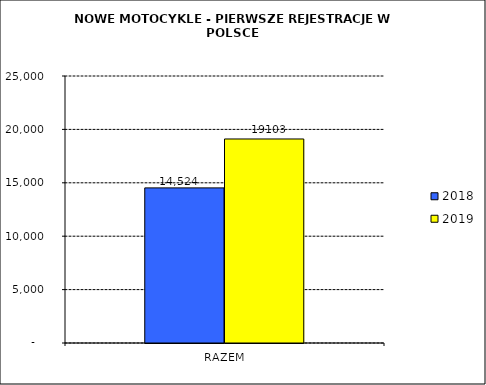
| Category | 2018 | 2019 |
|---|---|---|
| RAZEM | 14524 | 19103 |